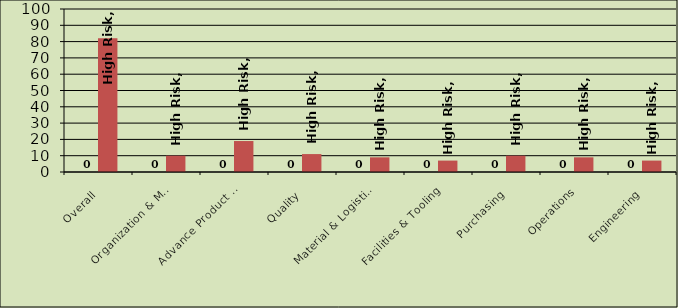
| Category | Series 0 | High Risk |
|---|---|---|
| Overall | 0 | 82 |
| Organization & Management | 0 | 10 |
| Advance Product Planning | 0 | 19 |
| Quality | 0 | 11 |
| Material & Logistics | 0 | 9 |
| Facilities & Tooling | 0 | 7 |
| Purchasing | 0 | 10 |
| Operations | 0 | 9 |
| Engineering | 0 | 7 |